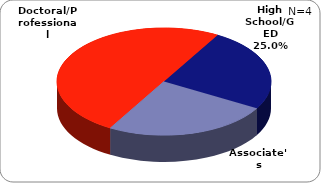
| Category | Series 0 |
|---|---|
| High School/GED | 0.25 |
| Associate's | 0.25 |
| Doctoral/Professional | 0.5 |